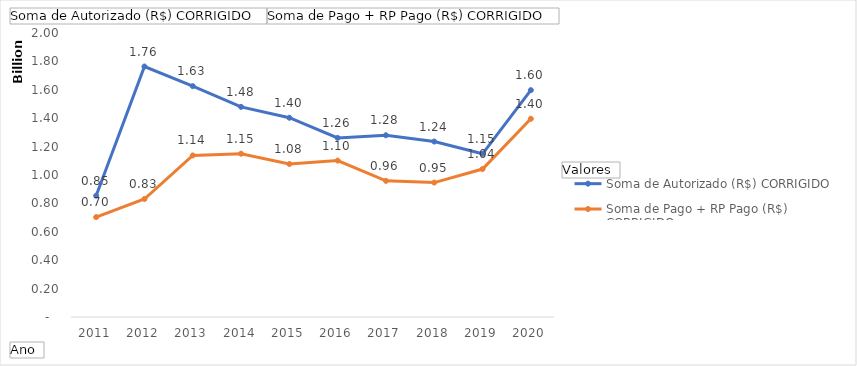
| Category | Soma de Autorizado (R$) CORRIGIDO | Soma de Pago + RP Pago (R$) CORRIGIDO |
|---|---|---|
| 2011 | 854071742.716 | 703383634.377 |
| 2012 | 1763985398.561 | 830986022.142 |
| 2013 | 1625951018.072 | 1137666222.006 |
| 2014 | 1479856264.081 | 1150091315.418 |
| 2015 | 1403264153.56 | 1077474612.624 |
| 2016 | 1261330401.94 | 1101492063.522 |
| 2017 | 1279923085.742 | 958684354.24 |
| 2018 | 1235655779.597 | 946609224.427 |
| 2019 | 1149262576.779 | 1041948815.564 |
| 2020 | 1597637132 | 1396034806.03 |